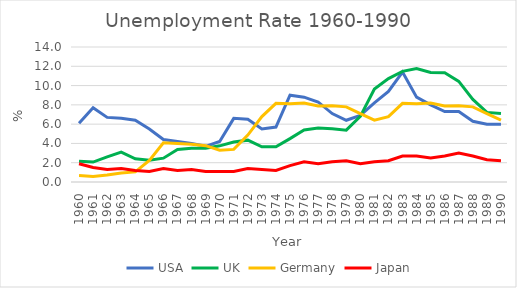
| Category | USA | UK | Germany | Japan |
|---|---|---|---|---|
| 1960.0 | 6.1 | 2.14 | 0.667 | 1.9 |
| 1961.0 | 7.7 | 2.07 | 0.583 | 1.5 |
| 1962.0 | 6.7 | 2.6 | 0.717 | 1.3 |
| 1963.0 | 6.6 | 3.1 | 0.933 | 1.4 |
| 1964.0 | 6.4 | 2.4 | 1.05 | 1.2 |
| 1965.0 | 5.5 | 2.26 | 2.242 | 1.1 |
| 1966.0 | 4.4 | 2.47 | 4.058 | 1.4 |
| 1967.0 | 4.2 | 3.37 | 3.983 | 1.2 |
| 1968.0 | 4 | 3.49 | 3.917 | 1.3 |
| 1969.0 | 3.7 | 3.5 | 3.767 | 1.1 |
| 1970.0 | 4.2 | 3.75 | 3.292 | 1.1 |
| 1971.0 | 6.6 | 4.14 | 3.383 | 1.1 |
| 1972.0 | 6.5 | 4.34 | 4.867 | 1.4 |
| 1973.0 | 5.5 | 3.65 | 6.783 | 1.3 |
| 1974.0 | 5.7 | 3.65 | 8.158 | 1.2 |
| 1975.0 | 9 | 4.5 | 8.117 | 1.7 |
| 1976.0 | 8.8 | 5.4 | 8.183 | 2.1 |
| 1977.0 | 8.3 | 5.59 | 7.892 | 1.9 |
| 1978.0 | 7.1 | 5.51 | 7.9 | 2.1 |
| 1979.0 | 6.4 | 5.38 | 7.792 | 2.2 |
| 1980.0 | 6.9 | 6.81 | 7.092 | 1.9 |
| 1981.0 | 8.2 | 9.65 | 6.417 | 2.1 |
| 1982.0 | 9.4 | 10.72 | 6.783 | 2.2 |
| 1983.0 | 11.4 | 11.47 | 8.158 | 2.7 |
| 1984.0 | 8.8 | 11.77 | 8.117 | 2.7 |
| 1985.0 | 8 | 11.36 | 8.183 | 2.5 |
| 1986.0 | 7.3 | 11.32 | 7.892 | 2.7 |
| 1987.0 | 7.3 | 10.43 | 7.9 | 3 |
| 1988.0 | 6.3 | 8.57 | 7.792 | 2.7 |
| 1989.0 | 6 | 7.22 | 7.092 | 2.3 |
| 1990.0 | 6 | 7.1 | 6.417 | 2.2 |